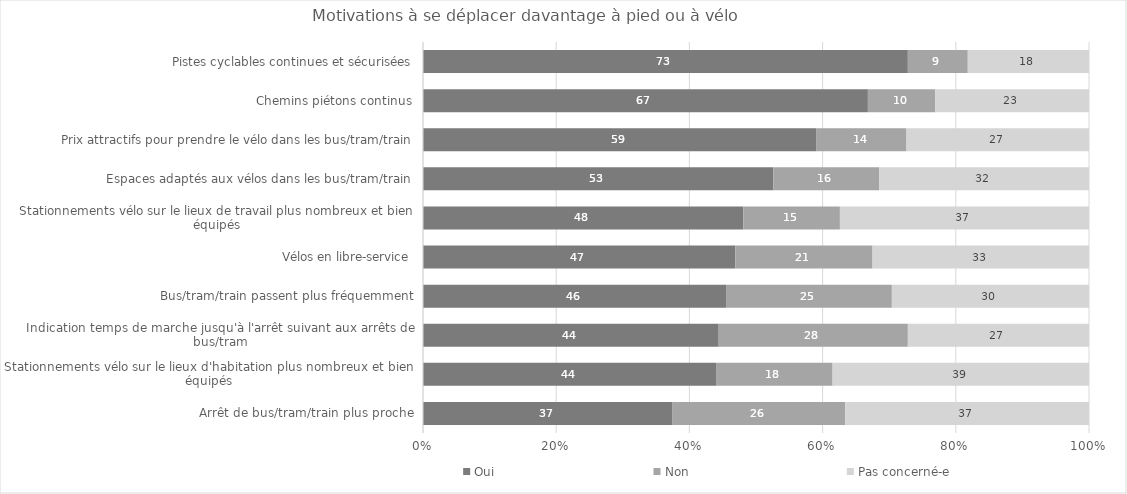
| Category | Oui | Non | Pas concerné-e |
|---|---|---|---|
| Pistes cyclables continues et sécurisées | 72.8 | 9 | 18.2 |
| Chemins piétons continus | 66.8 | 10.1 | 23.1 |
| Prix attractifs pour prendre le vélo dans les bus/tram/train | 59.1 | 13.5 | 27.4 |
| Espaces adaptés aux vélos dans les bus/tram/train | 52.6 | 15.9 | 31.5 |
| Stationnements vélo sur le lieux de travail plus nombreux et bien équipés | 48.1 | 14.5 | 37.4 |
| Vélos en libre-service | 46.9 | 20.6 | 32.5 |
| Bus/tram/train passent plus fréquemment | 45.5 | 24.9 | 29.6 |
| Indication temps de marche jusqu'à l'arrêt suivant aux arrêts de bus/tram | 44.4 | 28.4 | 27.2 |
| Stationnements vélo sur le lieux d'habitation plus nombreux et bien équipés | 44 | 17.5 | 38.5 |
| Arrêt de bus/tram/train plus proche | 37.4 | 26 | 36.6 |